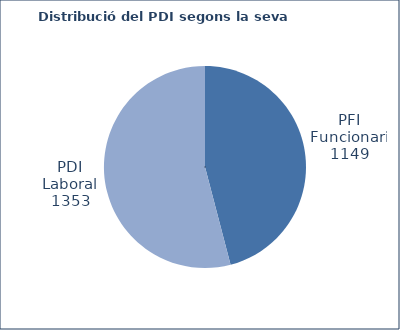
| Category | Series 0 |
|---|---|
| PFI Funcionari | 1149 |
| PDI Laboral | 1353 |